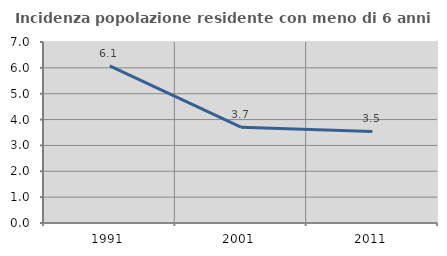
| Category | Incidenza popolazione residente con meno di 6 anni |
|---|---|
| 1991.0 | 6.08 |
| 2001.0 | 3.704 |
| 2011.0 | 3.542 |